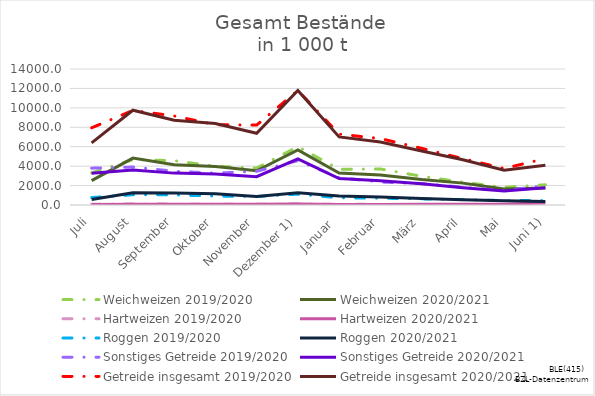
| Category | Weichweizen | Hartweizen | Roggen | Sonstiges Getreide | Getreide insgesamt |
|---|---|---|---|---|---|
| Juli | 2513.019 | 48.607 | 575.969 | 3264.103 | 6401.699 |
| August | 4825.702 | 80.436 | 1257.71 | 3593.807 | 9757.655 |
| September | 4136.565 | 79.319 | 1232.552 | 3281.504 | 8729.94 |
| Oktober | 3956.66 | 74.418 | 1158.822 | 3198.915 | 8388.816 |
| November | 3521.867 | 66.158 | 882.295 | 2916.403 | 7386.722 |
| Dezember 1) | 5679.648 | 98.842 | 1253.04 | 4751.241 | 11782.771 |
| Januar  | 3293.714 | 61.168 | 931.825 | 2722.913 | 7009.62 |
| Februar | 3093.25 | 61.11 | 823.189 | 2501.65 | 6479.198 |
| März | 2618.787 | 76.273 | 675.327 | 2189.661 | 5560.049 |
| April | 2251.674 | 76.47 | 549.968 | 1777.764 | 4655.877 |
| Mai | 1646.184 | 67.09 | 427.185 | 1431.502 | 3571.96 |
| Juni 1) | 1751.132 | 217.543 | 354.61 | 1771.063 | 4094.348 |